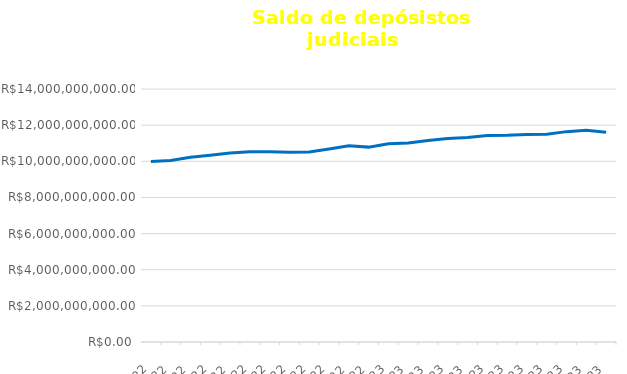
| Category | Depósitos Judiciais |
|---|---|
| 2022-01-01 | 9987217685.44 |
| 2022-02-01 | 10051317214.26 |
| 2022-03-01 | 10230019343.18 |
| 2022-04-01 | 10338097884.82 |
| 2022-05-01 | 10455936934.43 |
| 2022-06-01 | 10524849537 |
| 2022-07-01 | 10529205218.03 |
| 2022-08-01 | 10500392782.85 |
| 2022-09-01 | 10517354449.73 |
| 2022-10-01 | 10684423372.46 |
| 2022-11-01 | 10858477279.04 |
| 2022-12-01 | 10786789056.61 |
| 2023-01-01 | 10975602912.51 |
| 2023-02-01 | 11016906393.63 |
| 2023-03-01 | 11155603102.75 |
| 2023-04-01 | 11264185889.35 |
| 2023-05-01 | 11315019756.9 |
| 2023-06-01 | 11436177819.73 |
| 2023-07-01 | 11443090802.93 |
| 2023-08-01 | 11479473981.78 |
| 2023-09-01 | 11497755528.45 |
| 2023-10-01 | 11643770794.11 |
| 2023-11-01 | 11725251946.16 |
| 2023-12-01 | 11611565610.75 |